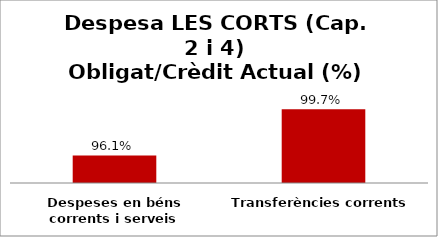
| Category | Series 0 |
|---|---|
| Despeses en béns corrents i serveis | 0.961 |
| Transferències corrents | 0.997 |